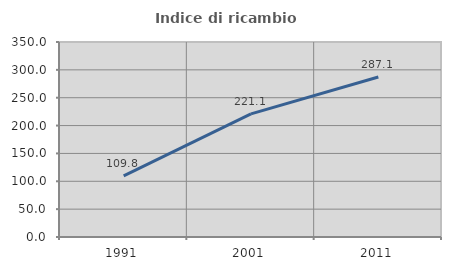
| Category | Indice di ricambio occupazionale  |
|---|---|
| 1991.0 | 109.783 |
| 2001.0 | 221.053 |
| 2011.0 | 287.097 |